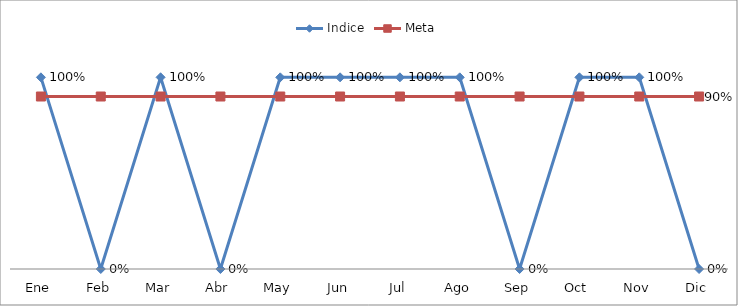
| Category | Indice | Meta |
|---|---|---|
| Ene | 1 | 0.9 |
| Feb | 0 | 0.9 |
| Mar | 1 | 0.9 |
| Abr | 0 | 0.9 |
| May | 1 | 0.9 |
| Jun | 1 | 0.9 |
| Jul | 1 | 0.9 |
| Ago | 1 | 0.9 |
| Sep | 0 | 0.9 |
| Oct | 1 | 0.9 |
| Nov | 1 | 0.9 |
| Dic | 0 | 0.9 |